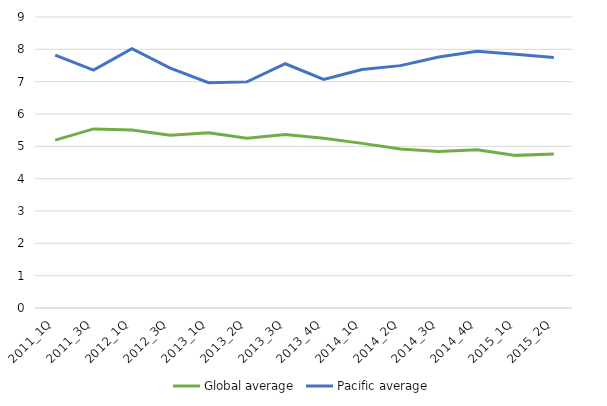
| Category | Global average | Pacific average |
|---|---|---|
| 2011_1Q | 5.19 | 7.822 |
| 2011_3Q | 5.539 | 7.358 |
| 2012_1Q | 5.506 | 8.019 |
| 2012_3Q | 5.342 | 7.416 |
| 2013_1Q | 5.419 | 6.968 |
| 2013_2Q | 5.252 | 6.994 |
| 2013_3Q | 5.365 | 7.554 |
| 2013_4Q | 5.249 | 7.07 |
| 2014_1Q | 5.091 | 7.376 |
| 2014_2Q | 4.921 | 7.496 |
| 2014_3Q | 4.842 | 7.761 |
| 2014_4Q | 4.893 | 7.938 |
| 2015_1Q | 4.72 | 7.85 |
| 2015_2Q | 4.766 | 7.75 |